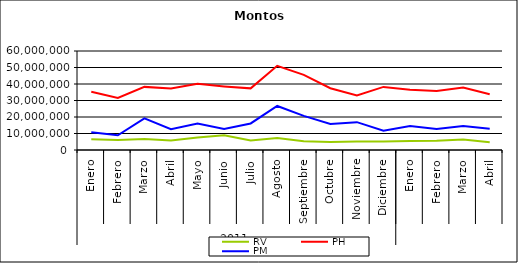
| Category | RV | PH | PM |
|---|---|---|---|
| 0 | 6487825.326 | 35303723.114 | 10794736.972 |
| 1 | 6110566.314 | 31543033.616 | 8949589.41 |
| 2 | 6685827.937 | 38254583.053 | 19173226.747 |
| 3 | 5828867.839 | 37231308.546 | 12601787.968 |
| 4 | 7513971.011 | 40073417.323 | 16113256.313 |
| 5 | 8932216.699 | 38550516.348 | 12687690.417 |
| 6 | 5707092.796 | 37364104.324 | 16088552.97 |
| 7 | 7311744.788 | 51023645.525 | 26693270.239 |
| 8 | 5327559.233 | 45524063.46 | 20703120.043 |
| 9 | 4775113.447 | 37461597.721 | 15748995.094 |
| 10 | 5126668.45 | 33072908.31 | 16864832.997 |
| 11 | 5216513.424 | 38231811.739 | 11627148.397 |
| 12 | 5488714.126 | 36545855.086 | 14497589.738 |
| 13 | 5561280.58 | 35823440.08 | 12698333.328 |
| 14 | 6398986.979 | 37854831.303 | 14475738.644 |
| 15 | 4681922.842 | 33750742.386 | 12858975.967 |